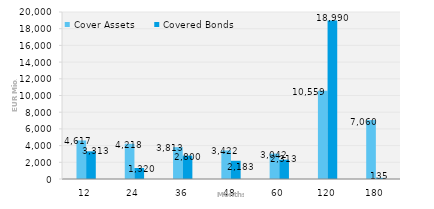
| Category | Cover Assets | Covered Bonds |
|---|---|---|
| 12.0 | 4617.408 | 3312.74 |
| 24.0 | 4218.376 | 1320 |
| 36.0 | 3813.239 | 2800 |
| 48.0 | 3421.538 | 2183 |
| 60.0 | 3042.28 | 2313 |
| 120.0 | 10558.752 | 18990 |
| 180.0 | 7059.592 | 135 |